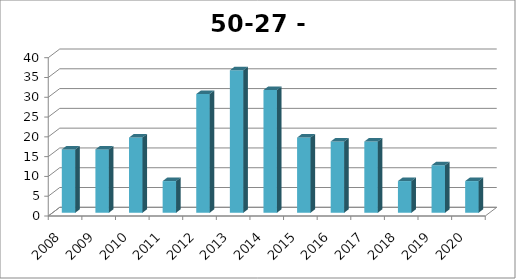
| Category | Goirle |
|---|---|
| 2008.0 | 16 |
| 2009.0 | 16 |
| 2010.0 | 19 |
| 2011.0 | 8 |
| 2012.0 | 30 |
| 2013.0 | 36 |
| 2014.0 | 31 |
| 2015.0 | 19 |
| 2016.0 | 18 |
| 2017.0 | 18 |
| 2018.0 | 8 |
| 2019.0 | 12 |
| 2020.0 | 8 |